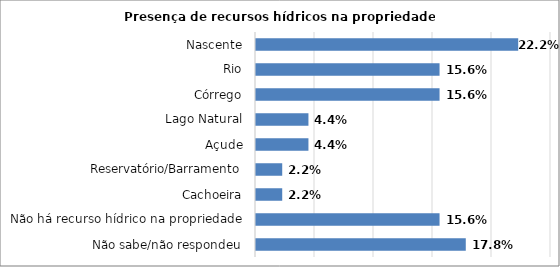
| Category | Series 0 |
|---|---|
| Não sabe/não respondeu | 0.178 |
| Não há recurso hídrico na propriedade | 0.156 |
| Cachoeira | 0.022 |
| Reservatório/Barramento | 0.022 |
| Açude | 0.044 |
| Lago Natural | 0.044 |
| Córrego | 0.156 |
| Rio | 0.156 |
| Nascente | 0.222 |